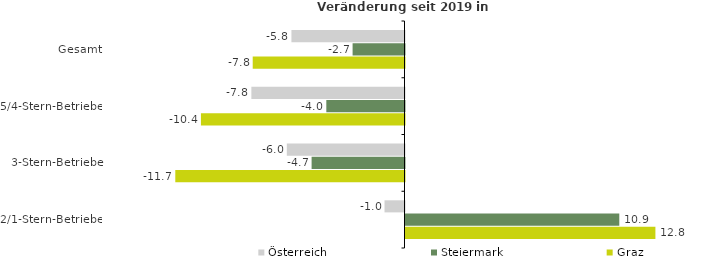
| Category | Österreich | Steiermark | Graz |
|---|---|---|---|
| Gesamt | -5.779 | -2.653 | -7.757 |
| 5/4-Stern-Betriebe | -7.825 | -3.996 | -10.404 |
| 3-Stern-Betriebe | -6.014 | -4.748 | -11.714 |
| 2/1-Stern-Betriebe | -1.021 | 10.926 | 12.772 |